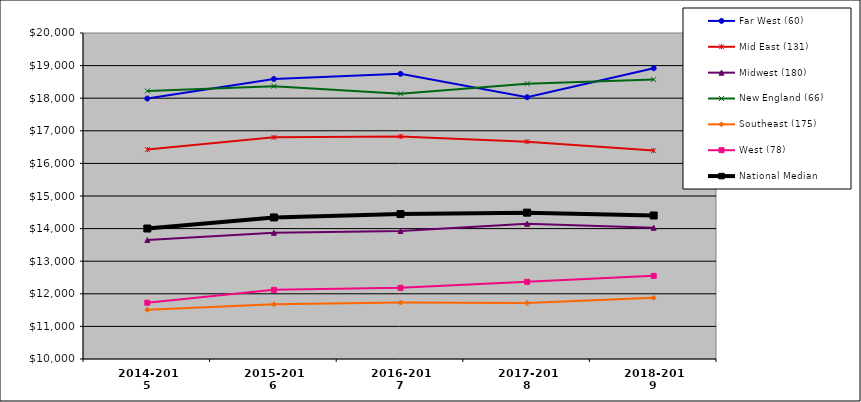
| Category | Far West (60) | Mid East (131) | Midwest (180) | New England (66) | Southeast (175) | West (78) | National Median |
|---|---|---|---|---|---|---|---|
| 2014-2015 | 17990.165 | 16425.409 | 13648.695 | 18222.694 | 11509.181 | 11726.401 | 14002.887 |
| 2015-2016 | 18590.033 | 16798.639 | 13872.237 | 18368.13 | 11677.167 | 12120.661 | 14342.086 |
| 2016-2017 | 18747.754 | 16826.098 | 13925.725 | 18135.857 | 11730.945 | 12184.106 | 14445.621 |
| 2017-2018 | 18029.549 | 16667.386 | 14149.197 | 18444.891 | 11717.493 | 12366.889 | 14489.448 |
| 2018-2019 | 18918.879 | 16393.781 | 14025.842 | 18573.545 | 11875.164 | 12550.288 | 14402.238 |